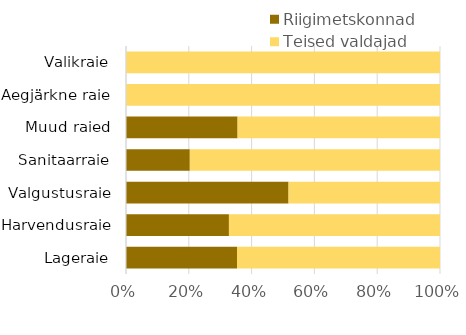
| Category | Riigimetskonnad | Teised valdajad |
|---|---|---|
| Lageraie | 11.54 | 21.105 |
| Harvendusraie | 6.208 | 12.73 |
| Valgustusraie | 10.646 | 9.92 |
| Sanitaarraie | 3.238 | 12.698 |
| Muud raied | 3.232 | 5.863 |
| Aegjärkne raie | 0 | 1.885 |
| Valikraie | 0 | 1.45 |